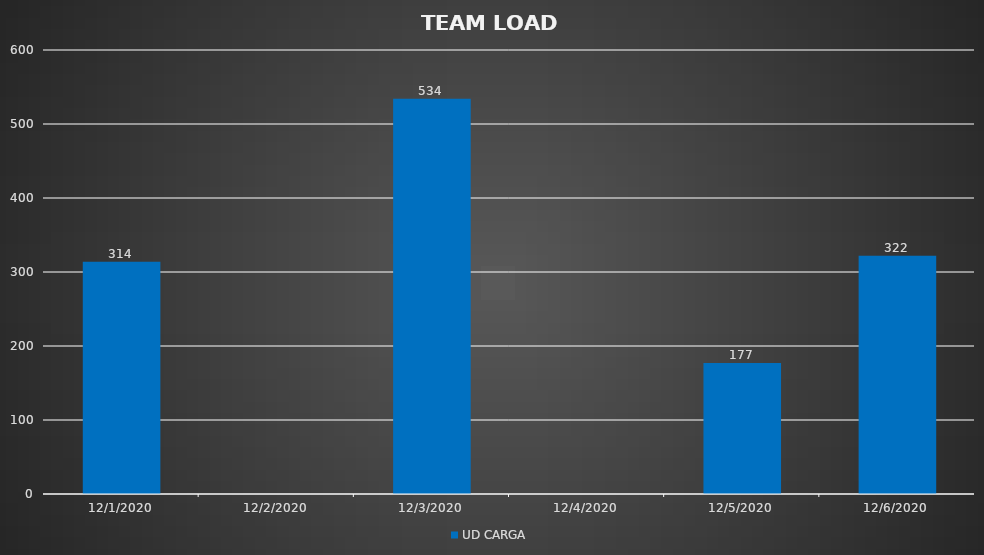
| Category | UD CARGA |
|---|---|
| 12/1/20 | 314 |
| 12/3/20 | 534 |
| 12/5/20 | 177 |
| 12/6/20 | 322 |